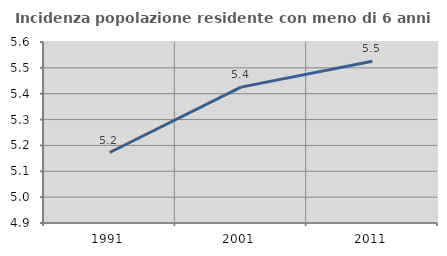
| Category | Incidenza popolazione residente con meno di 6 anni |
|---|---|
| 1991.0 | 5.173 |
| 2001.0 | 5.425 |
| 2011.0 | 5.526 |